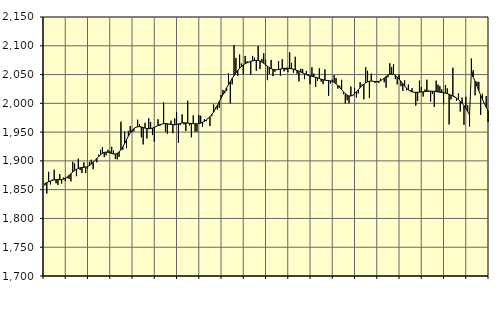
| Category | Piggar | Series 1 |
|---|---|---|
| nan | 1857.3 | 1860.96 |
| 1.0 | 1843.2 | 1862.29 |
| 1.0 | 1881 | 1863.7 |
| 1.0 | 1859.1 | 1865.03 |
| 1.0 | 1867.5 | 1866.13 |
| 1.0 | 1884.7 | 1866.98 |
| 1.0 | 1861.2 | 1867.26 |
| 1.0 | 1858.3 | 1867.4 |
| 1.0 | 1877.1 | 1867.34 |
| 1.0 | 1860.7 | 1867.57 |
| 1.0 | 1870.9 | 1868.35 |
| 1.0 | 1865 | 1869.82 |
| nan | 1870.1 | 1872.03 |
| 2.0 | 1868.7 | 1874.79 |
| 2.0 | 1864.4 | 1877.77 |
| 2.0 | 1898.5 | 1880.65 |
| 2.0 | 1895.5 | 1883.26 |
| 2.0 | 1873.5 | 1885.37 |
| 2.0 | 1903.9 | 1886.89 |
| 2.0 | 1884 | 1887.89 |
| 2.0 | 1878.9 | 1888.43 |
| 2.0 | 1897.3 | 1888.78 |
| 2.0 | 1878.7 | 1889.36 |
| 2.0 | 1886.3 | 1890.42 |
| nan | 1898.3 | 1892.15 |
| 3.0 | 1902 | 1894.54 |
| 3.0 | 1885.7 | 1897.49 |
| 3.0 | 1900.4 | 1900.83 |
| 3.0 | 1897.5 | 1904.29 |
| 3.0 | 1910.7 | 1907.7 |
| 3.0 | 1919.1 | 1910.79 |
| 3.0 | 1923.7 | 1913.23 |
| 3.0 | 1906.6 | 1914.75 |
| 3.0 | 1909.7 | 1915.34 |
| 3.0 | 1919.3 | 1915.04 |
| 3.0 | 1916.9 | 1914.11 |
| nan | 1924.4 | 1912.94 |
| 4.0 | 1917.9 | 1912.05 |
| 4.0 | 1903.1 | 1912 |
| 4.0 | 1902.7 | 1913.14 |
| 4.0 | 1907 | 1915.61 |
| 4.0 | 1968 | 1919.5 |
| 4.0 | 1919.1 | 1924.59 |
| 4.0 | 1950.9 | 1930.48 |
| 4.0 | 1922 | 1936.82 |
| 4.0 | 1952.2 | 1943.05 |
| 4.0 | 1960.6 | 1948.55 |
| 4.0 | 1950.2 | 1952.96 |
| nan | 1951.4 | 1956.22 |
| 5.0 | 1957.6 | 1958.31 |
| 5.0 | 1971.6 | 1959.31 |
| 5.0 | 1963.9 | 1959.47 |
| 5.0 | 1941 | 1959.03 |
| 5.0 | 1928.6 | 1958.08 |
| 5.0 | 1966.2 | 1957 |
| 5.0 | 1939 | 1956.19 |
| 5.0 | 1973.9 | 1955.86 |
| 5.0 | 1967.5 | 1956.17 |
| 5.0 | 1944.9 | 1957.04 |
| 5.0 | 1933.6 | 1958.33 |
| nan | 1959.5 | 1959.79 |
| 6.0 | 1972.3 | 1961.34 |
| 6.0 | 1960.9 | 1962.8 |
| 6.0 | 1964.3 | 1963.89 |
| 6.0 | 2001.7 | 1964.58 |
| 6.0 | 1950.9 | 1964.93 |
| 6.0 | 1947.2 | 1964.69 |
| 6.0 | 1963.3 | 1964.03 |
| 6.0 | 1969.9 | 1963.35 |
| 6.0 | 1948.2 | 1962.77 |
| 6.0 | 1973.9 | 1962.66 |
| 6.0 | 1985 | 1963.22 |
| nan | 1931.7 | 1964.2 |
| 7.0 | 1962.1 | 1965.14 |
| 7.0 | 1980.8 | 1965.85 |
| 7.0 | 1963.3 | 1966.19 |
| 7.0 | 1951.9 | 1966.1 |
| 7.0 | 2004.5 | 1965.67 |
| 7.0 | 1961.5 | 1965.27 |
| 7.0 | 1941.1 | 1964.96 |
| 7.0 | 1979.1 | 1964.66 |
| 7.0 | 1950.7 | 1964.42 |
| 7.0 | 1950.8 | 1964.42 |
| 7.0 | 1979.5 | 1964.75 |
| nan | 1978.5 | 1965.58 |
| 8.0 | 1959.6 | 1966.98 |
| 8.0 | 1972.5 | 1968.79 |
| 8.0 | 1969 | 1971.05 |
| 8.0 | 1974.2 | 1973.72 |
| 8.0 | 1960.7 | 1976.85 |
| 8.0 | 1977.7 | 1980.52 |
| 8.0 | 1998.1 | 1985.01 |
| 8.0 | 1992.7 | 1990.34 |
| 8.0 | 1989.2 | 1996.31 |
| 8.0 | 1992.3 | 2002.65 |
| 8.0 | 2014.6 | 2009 |
| nan | 2023.3 | 2015.2 |
| 9.0 | 2017.6 | 2021.16 |
| 9.0 | 2021.4 | 2026.9 |
| 9.0 | 2052.2 | 2032.4 |
| 9.0 | 2000 | 2037.83 |
| 9.0 | 2033.1 | 2043.13 |
| 9.0 | 2101.1 | 2048.18 |
| 9.0 | 2078.9 | 2052.91 |
| 9.0 | 2048.1 | 2057.1 |
| 9.0 | 2084.7 | 2060.83 |
| 9.0 | 2069.1 | 2064.1 |
| 9.0 | 2050.8 | 2066.76 |
| nan | 2082.3 | 2068.76 |
| 10.0 | 2073 | 2070.35 |
| 10.0 | 2072 | 2071.75 |
| 10.0 | 2049.8 | 2072.86 |
| 10.0 | 2082.4 | 2073.7 |
| 10.0 | 2079.2 | 2074.33 |
| 10.0 | 2056.6 | 2074.64 |
| 10.0 | 2099.5 | 2074.38 |
| 10.0 | 2059.5 | 2073.53 |
| 10.0 | 2077.3 | 2071.92 |
| 10.0 | 2087.1 | 2069.63 |
| 10.0 | 2075.9 | 2067.04 |
| nan | 2040.3 | 2064.45 |
| 11.0 | 2051.1 | 2062.1 |
| 11.0 | 2075.4 | 2060.23 |
| 11.0 | 2047.2 | 2059.03 |
| 11.0 | 2054.8 | 2058.44 |
| 11.0 | 2058 | 2058.33 |
| 11.0 | 2073.4 | 2058.74 |
| 11.0 | 2048.1 | 2059.48 |
| 11.0 | 2076.5 | 2060.2 |
| 11.0 | 2055.6 | 2060.82 |
| 11.0 | 2058.3 | 2061.08 |
| 11.0 | 2054.2 | 2060.95 |
| nan | 2088.6 | 2060.62 |
| 12.0 | 2070.3 | 2060.12 |
| 12.0 | 2053.3 | 2059.3 |
| 12.0 | 2080.9 | 2058.27 |
| 12.0 | 2051.4 | 2057.18 |
| 12.0 | 2038.2 | 2055.91 |
| 12.0 | 2060.1 | 2054.45 |
| 12.0 | 2059.3 | 2052.91 |
| 12.0 | 2042 | 2051.34 |
| 12.0 | 2056.2 | 2049.78 |
| 12.0 | 2050.6 | 2048.55 |
| 12.0 | 2033.1 | 2047.66 |
| nan | 2062.5 | 2046.99 |
| 13.0 | 2051.6 | 2046.27 |
| 13.0 | 2028.5 | 2045.34 |
| 13.0 | 2039.4 | 2044.24 |
| 13.0 | 2060.8 | 2043.07 |
| 13.0 | 2037.7 | 2041.96 |
| 13.0 | 2033.4 | 2041 |
| 13.0 | 2059.1 | 2040.25 |
| 13.0 | 2040.5 | 2039.76 |
| 13.0 | 2013.2 | 2039.45 |
| 13.0 | 2034.5 | 2038.94 |
| 13.0 | 2041.1 | 2038 |
| nan | 2049 | 2036.37 |
| 14.0 | 2043.9 | 2033.97 |
| 14.0 | 2025.6 | 2030.98 |
| 14.0 | 2030.6 | 2027.53 |
| 14.0 | 2040.9 | 2023.74 |
| 14.0 | 2015.9 | 2020.06 |
| 14.0 | 1999.8 | 2016.8 |
| 14.0 | 2005.5 | 2014.2 |
| 14.0 | 2000.1 | 2012.73 |
| 14.0 | 2029.1 | 2012.7 |
| 14.0 | 2012.6 | 2014.11 |
| 14.0 | 2026.9 | 2016.65 |
| nan | 2010 | 2019.95 |
| 15.0 | 2017.2 | 2023.61 |
| 15.0 | 2036.9 | 2027.28 |
| 15.0 | 2032.7 | 2030.63 |
| 15.0 | 2007.1 | 2033.4 |
| 15.0 | 2063 | 2035.59 |
| 15.0 | 2056.6 | 2037.27 |
| 15.0 | 2009.4 | 2038.32 |
| 15.0 | 2051.7 | 2038.68 |
| 15.0 | 2038.7 | 2038.43 |
| 15.0 | 2035.4 | 2037.9 |
| 15.0 | 2036.7 | 2037.66 |
| nan | 2035.2 | 2038.03 |
| 16.0 | 2042.9 | 2039.25 |
| 16.0 | 2041.2 | 2041.31 |
| 16.0 | 2036.6 | 2043.87 |
| 16.0 | 2027.2 | 2046.6 |
| 16.0 | 2045.2 | 2048.98 |
| 16.0 | 2069.6 | 2050.47 |
| 16.0 | 2063.2 | 2050.9 |
| 16.0 | 2068.1 | 2050.23 |
| 16.0 | 2042.1 | 2048.45 |
| 16.0 | 2032.9 | 2045.81 |
| 16.0 | 2050 | 2042.39 |
| nan | 2029.8 | 2038.36 |
| 17.0 | 2021.4 | 2034.11 |
| 17.0 | 2039.9 | 2030.02 |
| 17.0 | 2022.5 | 2026.36 |
| 17.0 | 2032.7 | 2023.4 |
| 17.0 | 2022.4 | 2021.3 |
| 17.0 | 2026.3 | 2019.95 |
| 17.0 | 2019.2 | 2019.3 |
| 17.0 | 1995.9 | 2019.13 |
| 17.0 | 2004.1 | 2019.21 |
| 17.0 | 2039.4 | 2019.45 |
| 17.0 | 2028.1 | 2019.7 |
| nan | 2011.8 | 2020.01 |
| 18.0 | 2024.1 | 2020.35 |
| 18.0 | 2041 | 2020.58 |
| 18.0 | 2022.4 | 2020.86 |
| 18.0 | 2003.1 | 2021.2 |
| 18.0 | 2016.1 | 2021.23 |
| 18.0 | 1993.7 | 2020.91 |
| 18.0 | 2039.5 | 2020.38 |
| 18.0 | 2032.4 | 2019.8 |
| 18.0 | 2030 | 2019.34 |
| 18.0 | 2024.3 | 2018.84 |
| 18.0 | 1998.2 | 2018.33 |
| nan | 2032 | 2017.71 |
| 19.0 | 2026 | 2016.84 |
| 19.0 | 1963.2 | 2015.71 |
| 19.0 | 2006.7 | 2014.26 |
| 19.0 | 2061.8 | 2012.6 |
| 19.0 | 2011.8 | 2010.88 |
| 19.0 | 2004.3 | 2008.98 |
| 19.0 | 2017.3 | 2006.61 |
| 19.0 | 1985.8 | 2003.65 |
| 19.0 | 2010 | 2000.08 |
| 19.0 | 1962.6 | 1995.87 |
| 19.0 | 2011.4 | 1991 |
| nan | 1996.7 | 1985.63 |
| 20.0 | 1960 | 1979.8 |
| 20.0 | 2077.8 | 2056.01 |
| 20.0 | 2057.6 | 2045.54 |
| 20.0 | 2013.9 | 2038.41 |
| 20.0 | 2037.7 | 2029.86 |
| 20.0 | 2037.3 | 2021.98 |
| 20.0 | 1980 | 2014.18 |
| 20.0 | 2016.6 | 2006.68 |
| 20.0 | 2000.6 | 1999.68 |
| 20.0 | 2012.8 | 1993.21 |
| 20.0 | 1967.5 | 1987.28 |